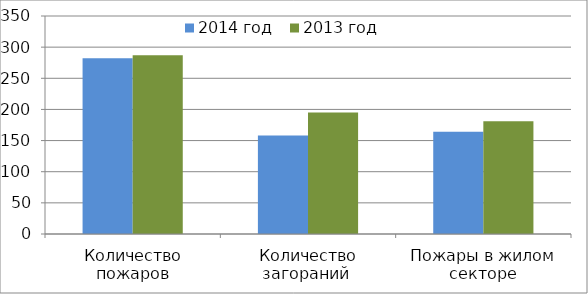
| Category | 2014 год | 2013 год |
|---|---|---|
| Количество пожаров | 282 | 287 |
| Количество загораний  | 158 | 195 |
| Пожары в жилом секторе | 164 | 181 |